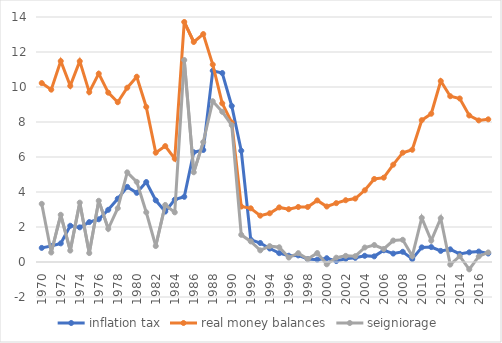
| Category | inflation tax | real money balances | seigniorage |
|---|---|---|---|
| 1970.0 | 0.806 | 10.224 | 3.323 |
| 1971.0 | 0.919 | 9.848 | 0.543 |
| 1972.0 | 1.064 | 11.481 | 2.697 |
| 1973.0 | 2.071 | 10.062 | 0.652 |
| 1974.0 | 1.979 | 11.476 | 3.393 |
| 1975.0 | 2.28 | 9.706 | 0.511 |
| 1976.0 | 2.44 | 10.763 | 3.497 |
| 1977.0 | 2.982 | 9.677 | 1.896 |
| 1978.0 | 3.618 | 9.131 | 3.072 |
| 1979.0 | 4.293 | 9.959 | 5.122 |
| 1980.0 | 3.953 | 10.586 | 4.58 |
| 1981.0 | 4.569 | 8.858 | 2.84 |
| 1982.0 | 3.525 | 6.246 | 0.913 |
| 1983.0 | 2.88 | 6.624 | 3.258 |
| 1984.0 | 3.561 | 5.9 | 2.838 |
| 1985.0 | 3.725 | 13.715 | 11.54 |
| 1986.0 | 6.271 | 12.572 | 5.128 |
| 1987.0 | 6.401 | 13.024 | 6.853 |
| 1988.0 | 10.928 | 11.28 | 9.184 |
| 1989.0 | 10.798 | 9.066 | 8.584 |
| 1990.0 | 8.916 | 7.97 | 7.82 |
| 1991.0 | 6.355 | 3.17 | 1.554 |
| 1992.0 | 1.278 | 3.068 | 1.176 |
| 1993.0 | 1.085 | 2.648 | 0.666 |
| 1994.0 | 0.77 | 2.784 | 0.906 |
| 1995.0 | 0.506 | 3.119 | 0.841 |
| 1996.0 | 0.358 | 3.016 | 0.255 |
| 1997.0 | 0.377 | 3.144 | 0.505 |
| 1998.0 | 0.164 | 3.144 | 0.164 |
| 1999.0 | 0.136 | 3.519 | 0.511 |
| 2000.0 | 0.217 | 3.171 | -0.131 |
| 2001.0 | 0.054 | 3.363 | 0.246 |
| 2002.0 | 0.184 | 3.53 | 0.351 |
| 2003.0 | 0.239 | 3.623 | 0.332 |
| 2004.0 | 0.355 | 4.096 | 0.828 |
| 2005.0 | 0.322 | 4.745 | 0.97 |
| 2006.0 | 0.67 | 4.819 | 0.744 |
| 2007.0 | 0.482 | 5.561 | 1.225 |
| 2008.0 | 0.584 | 6.246 | 1.269 |
| 2009.0 | 0.169 | 6.414 | 0.337 |
| 2010.0 | 0.835 | 8.104 | 2.525 |
| 2011.0 | 0.853 | 8.472 | 1.221 |
| 2012.0 | 0.634 | 10.342 | 2.504 |
| 2013.0 | 0.723 | 9.473 | -0.146 |
| 2014.0 | 0.464 | 9.344 | 0.335 |
| 2015.0 | 0.552 | 8.372 | -0.42 |
| 2016.0 | 0.597 | 8.091 | 0.316 |
| 2017.0 | 0.485 | 8.152 | 0.546 |